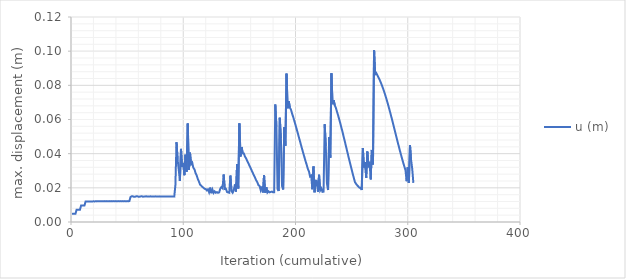
| Category | u (m) |
|---|---|
| 1.0 | 0.005 |
| 2.0 | 0.005 |
| 3.0 | 0.005 |
| 4.0 | 0.005 |
| 5.0 | 0.007 |
| 6.0 | 0.007 |
| 7.0 | 0.007 |
| 8.0 | 0.007 |
| 9.0 | 0.01 |
| 10.0 | 0.01 |
| 11.0 | 0.01 |
| 12.0 | 0.01 |
| 13.0 | 0.012 |
| 14.0 | 0.012 |
| 15.0 | 0.012 |
| 16.0 | 0.012 |
| 17.0 | 0.012 |
| 18.0 | 0.012 |
| 19.0 | 0.012 |
| 20.0 | 0.012 |
| 21.0 | 0.012 |
| 22.0 | 0.012 |
| 23.0 | 0.012 |
| 24.0 | 0.012 |
| 25.0 | 0.012 |
| 26.0 | 0.012 |
| 27.0 | 0.012 |
| 28.0 | 0.012 |
| 29.0 | 0.012 |
| 30.0 | 0.012 |
| 31.0 | 0.012 |
| 32.0 | 0.012 |
| 33.0 | 0.012 |
| 34.0 | 0.012 |
| 35.0 | 0.012 |
| 36.0 | 0.012 |
| 37.0 | 0.012 |
| 38.0 | 0.012 |
| 39.0 | 0.012 |
| 40.0 | 0.012 |
| 41.0 | 0.012 |
| 42.0 | 0.012 |
| 43.0 | 0.012 |
| 44.0 | 0.012 |
| 45.0 | 0.012 |
| 46.0 | 0.012 |
| 47.0 | 0.012 |
| 48.0 | 0.012 |
| 49.0 | 0.012 |
| 50.0 | 0.012 |
| 51.0 | 0.012 |
| 52.0 | 0.012 |
| 53.0 | 0.015 |
| 54.0 | 0.015 |
| 55.0 | 0.015 |
| 56.0 | 0.015 |
| 57.0 | 0.015 |
| 58.0 | 0.015 |
| 59.0 | 0.015 |
| 60.0 | 0.015 |
| 61.0 | 0.015 |
| 62.0 | 0.015 |
| 63.0 | 0.015 |
| 64.0 | 0.015 |
| 65.0 | 0.015 |
| 66.0 | 0.015 |
| 67.0 | 0.015 |
| 68.0 | 0.015 |
| 69.0 | 0.015 |
| 70.0 | 0.015 |
| 71.0 | 0.015 |
| 72.0 | 0.015 |
| 73.0 | 0.015 |
| 74.0 | 0.015 |
| 75.0 | 0.015 |
| 76.0 | 0.015 |
| 77.0 | 0.015 |
| 78.0 | 0.015 |
| 79.0 | 0.015 |
| 80.0 | 0.015 |
| 81.0 | 0.015 |
| 82.0 | 0.015 |
| 83.0 | 0.015 |
| 84.0 | 0.015 |
| 85.0 | 0.015 |
| 86.0 | 0.015 |
| 87.0 | 0.015 |
| 88.0 | 0.015 |
| 89.0 | 0.015 |
| 90.0 | 0.015 |
| 91.0 | 0.015 |
| 92.0 | 0.015 |
| 93.0 | 0.022 |
| 94.0 | 0.047 |
| 95.0 | 0.036 |
| 96.0 | 0.03 |
| 97.0 | 0.024 |
| 98.0 | 0.043 |
| 99.0 | 0.032 |
| 100.0 | 0.035 |
| 101.0 | 0.027 |
| 102.0 | 0.039 |
| 103.0 | 0.029 |
| 104.0 | 0.058 |
| 105.0 | 0.03 |
| 106.0 | 0.041 |
| 107.0 | 0.034 |
| 108.0 | 0.035 |
| 109.0 | 0.032 |
| 110.0 | 0.031 |
| 111.0 | 0.029 |
| 112.0 | 0.027 |
| 113.0 | 0.025 |
| 114.0 | 0.024 |
| 115.0 | 0.022 |
| 116.0 | 0.021 |
| 117.0 | 0.021 |
| 118.0 | 0.02 |
| 119.0 | 0.019 |
| 120.0 | 0.019 |
| 121.0 | 0.019 |
| 122.0 | 0.019 |
| 123.0 | 0.017 |
| 124.0 | 0.02 |
| 125.0 | 0.017 |
| 126.0 | 0.019 |
| 127.0 | 0.017 |
| 128.0 | 0.018 |
| 129.0 | 0.017 |
| 130.0 | 0.018 |
| 131.0 | 0.017 |
| 132.0 | 0.017 |
| 133.0 | 0.02 |
| 134.0 | 0.02 |
| 135.0 | 0.02 |
| 136.0 | 0.028 |
| 137.0 | 0.019 |
| 138.0 | 0.019 |
| 139.0 | 0.018 |
| 140.0 | 0.017 |
| 141.0 | 0.017 |
| 142.0 | 0.027 |
| 143.0 | 0.018 |
| 144.0 | 0.017 |
| 145.0 | 0.019 |
| 146.0 | 0.022 |
| 147.0 | 0.018 |
| 148.0 | 0.034 |
| 149.0 | 0.02 |
| 150.0 | 0.058 |
| 151.0 | 0.038 |
| 152.0 | 0.044 |
| 153.0 | 0.04 |
| 154.0 | 0.04 |
| 155.0 | 0.038 |
| 156.0 | 0.037 |
| 157.0 | 0.036 |
| 158.0 | 0.034 |
| 159.0 | 0.033 |
| 160.0 | 0.032 |
| 161.0 | 0.03 |
| 162.0 | 0.029 |
| 163.0 | 0.027 |
| 164.0 | 0.026 |
| 165.0 | 0.024 |
| 166.0 | 0.023 |
| 167.0 | 0.022 |
| 168.0 | 0.021 |
| 169.0 | 0.019 |
| 170.0 | 0.021 |
| 171.0 | 0.017 |
| 172.0 | 0.027 |
| 173.0 | 0.017 |
| 174.0 | 0.02 |
| 175.0 | 0.017 |
| 176.0 | 0.018 |
| 177.0 | 0.017 |
| 178.0 | 0.018 |
| 179.0 | 0.018 |
| 180.0 | 0.017 |
| 181.0 | 0.017 |
| 182.0 | 0.069 |
| 183.0 | 0.056 |
| 184.0 | 0.019 |
| 185.0 | 0.018 |
| 186.0 | 0.061 |
| 187.0 | 0.049 |
| 188.0 | 0.021 |
| 189.0 | 0.019 |
| 190.0 | 0.056 |
| 191.0 | 0.045 |
| 192.0 | 0.087 |
| 193.0 | 0.067 |
| 194.0 | 0.071 |
| 195.0 | 0.067 |
| 196.0 | 0.066 |
| 197.0 | 0.063 |
| 198.0 | 0.061 |
| 199.0 | 0.059 |
| 200.0 | 0.057 |
| 201.0 | 0.054 |
| 202.0 | 0.052 |
| 203.0 | 0.05 |
| 204.0 | 0.047 |
| 205.0 | 0.045 |
| 206.0 | 0.042 |
| 207.0 | 0.04 |
| 208.0 | 0.038 |
| 209.0 | 0.036 |
| 210.0 | 0.033 |
| 211.0 | 0.031 |
| 212.0 | 0.03 |
| 213.0 | 0.027 |
| 214.0 | 0.027 |
| 215.0 | 0.019 |
| 216.0 | 0.033 |
| 217.0 | 0.017 |
| 218.0 | 0.024 |
| 219.0 | 0.024 |
| 220.0 | 0.018 |
| 221.0 | 0.028 |
| 222.0 | 0.018 |
| 223.0 | 0.02 |
| 224.0 | 0.018 |
| 225.0 | 0.018 |
| 226.0 | 0.057 |
| 227.0 | 0.044 |
| 228.0 | 0.023 |
| 229.0 | 0.019 |
| 230.0 | 0.05 |
| 231.0 | 0.038 |
| 232.0 | 0.087 |
| 233.0 | 0.069 |
| 234.0 | 0.071 |
| 235.0 | 0.068 |
| 236.0 | 0.067 |
| 237.0 | 0.064 |
| 238.0 | 0.062 |
| 239.0 | 0.06 |
| 240.0 | 0.058 |
| 241.0 | 0.055 |
| 242.0 | 0.052 |
| 243.0 | 0.05 |
| 244.0 | 0.047 |
| 245.0 | 0.044 |
| 246.0 | 0.042 |
| 247.0 | 0.039 |
| 248.0 | 0.036 |
| 249.0 | 0.033 |
| 250.0 | 0.031 |
| 251.0 | 0.028 |
| 252.0 | 0.026 |
| 253.0 | 0.023 |
| 254.0 | 0.022 |
| 255.0 | 0.021 |
| 256.0 | 0.021 |
| 257.0 | 0.02 |
| 258.0 | 0.02 |
| 259.0 | 0.019 |
| 260.0 | 0.043 |
| 261.0 | 0.032 |
| 262.0 | 0.035 |
| 263.0 | 0.026 |
| 264.0 | 0.041 |
| 265.0 | 0.033 |
| 266.0 | 0.034 |
| 267.0 | 0.025 |
| 268.0 | 0.042 |
| 269.0 | 0.034 |
| 270.0 | 0.101 |
| 271.0 | 0.086 |
| 272.0 | 0.087 |
| 273.0 | 0.086 |
| 274.0 | 0.085 |
| 275.0 | 0.083 |
| 276.0 | 0.082 |
| 277.0 | 0.08 |
| 278.0 | 0.078 |
| 279.0 | 0.076 |
| 280.0 | 0.074 |
| 281.0 | 0.072 |
| 282.0 | 0.07 |
| 283.0 | 0.067 |
| 284.0 | 0.065 |
| 285.0 | 0.063 |
| 286.0 | 0.06 |
| 287.0 | 0.057 |
| 288.0 | 0.055 |
| 289.0 | 0.052 |
| 290.0 | 0.049 |
| 291.0 | 0.047 |
| 292.0 | 0.044 |
| 293.0 | 0.042 |
| 294.0 | 0.039 |
| 295.0 | 0.037 |
| 296.0 | 0.035 |
| 297.0 | 0.032 |
| 298.0 | 0.03 |
| 299.0 | 0.024 |
| 300.0 | 0.032 |
| 301.0 | 0.023 |
| 302.0 | 0.045 |
| 303.0 | 0.036 |
| 304.0 | 0.031 |
| 305.0 | 0.023 |
| 305.0 | 0.023 |
| 305.0 | 0.023 |
| 305.0 | 0.023 |
| 305.0 | 0.023 |
| 305.0 | 0.023 |
| 305.0 | 0.023 |
| 305.0 | 0.023 |
| 305.0 | 0.023 |
| 305.0 | 0.023 |
| 305.0 | 0.023 |
| 305.0 | 0.023 |
| 305.0 | 0.023 |
| 305.0 | 0.023 |
| 305.0 | 0.023 |
| 305.0 | 0.023 |
| 305.0 | 0.023 |
| 305.0 | 0.023 |
| 305.0 | 0.023 |
| 305.0 | 0.023 |
| 305.0 | 0.023 |
| 305.0 | 0.023 |
| 305.0 | 0.023 |
| 305.0 | 0.023 |
| 305.0 | 0.023 |
| 305.0 | 0.023 |
| 305.0 | 0.023 |
| 305.0 | 0.023 |
| 305.0 | 0.023 |
| 305.0 | 0.023 |
| 305.0 | 0.023 |
| 305.0 | 0.023 |
| 305.0 | 0.023 |
| 305.0 | 0.023 |
| 305.0 | 0.023 |
| 305.0 | 0.023 |
| 305.0 | 0.023 |
| 305.0 | 0.023 |
| 305.0 | 0.023 |
| 305.0 | 0.023 |
| 305.0 | 0.023 |
| 305.0 | 0.023 |
| 305.0 | 0.023 |
| 305.0 | 0.023 |
| 305.0 | 0.023 |
| 305.0 | 0.023 |
| 305.0 | 0.023 |
| 305.0 | 0.023 |
| 305.0 | 0.023 |
| 305.0 | 0.023 |
| 305.0 | 0.023 |
| 305.0 | 0.023 |
| 305.0 | 0.023 |
| 305.0 | 0.023 |
| 305.0 | 0.023 |
| 305.0 | 0.023 |
| 305.0 | 0.023 |
| 305.0 | 0.023 |
| 305.0 | 0.023 |
| 305.0 | 0.023 |
| 305.0 | 0.023 |
| 305.0 | 0.023 |
| 305.0 | 0.023 |
| 305.0 | 0.023 |
| 305.0 | 0.023 |
| 305.0 | 0.023 |
| 305.0 | 0.023 |
| 305.0 | 0.023 |
| 305.0 | 0.023 |
| 305.0 | 0.023 |
| 305.0 | 0.023 |
| 305.0 | 0.023 |
| 305.0 | 0.023 |
| 305.0 | 0.023 |
| 305.0 | 0.023 |
| 305.0 | 0.023 |
| 305.0 | 0.023 |
| 305.0 | 0.023 |
| 305.0 | 0.023 |
| 305.0 | 0.023 |
| 305.0 | 0.023 |
| 305.0 | 0.023 |
| 305.0 | 0.023 |
| 305.0 | 0.023 |
| 305.0 | 0.023 |
| 305.0 | 0.023 |
| 305.0 | 0.023 |
| 305.0 | 0.023 |
| 305.0 | 0.023 |
| 305.0 | 0.023 |
| 305.0 | 0.023 |
| 305.0 | 0.023 |
| 305.0 | 0.023 |
| 305.0 | 0.023 |
| 305.0 | 0.023 |
| 305.0 | 0.023 |
| 305.0 | 0.023 |
| 305.0 | 0.023 |
| 305.0 | 0.023 |
| 305.0 | 0.023 |
| 305.0 | 0.023 |
| 305.0 | 0.023 |
| 305.0 | 0.023 |
| 305.0 | 0.023 |
| 305.0 | 0.023 |
| 305.0 | 0.023 |
| 305.0 | 0.023 |
| 305.0 | 0.023 |
| 305.0 | 0.023 |
| 305.0 | 0.023 |
| 305.0 | 0.023 |
| 305.0 | 0.023 |
| 305.0 | 0.023 |
| 305.0 | 0.023 |
| 305.0 | 0.023 |
| 305.0 | 0.023 |
| 305.0 | 0.023 |
| 305.0 | 0.023 |
| 305.0 | 0.023 |
| 305.0 | 0.023 |
| 305.0 | 0.023 |
| 305.0 | 0.023 |
| 305.0 | 0.023 |
| 305.0 | 0.023 |
| 305.0 | 0.023 |
| 305.0 | 0.023 |
| 305.0 | 0.023 |
| 305.0 | 0.023 |
| 305.0 | 0.023 |
| 305.0 | 0.023 |
| 305.0 | 0.023 |
| 305.0 | 0.023 |
| 305.0 | 0.023 |
| 305.0 | 0.023 |
| 305.0 | 0.023 |
| 305.0 | 0.023 |
| 305.0 | 0.023 |
| 305.0 | 0.023 |
| 305.0 | 0.023 |
| 305.0 | 0.023 |
| 305.0 | 0.023 |
| 305.0 | 0.023 |
| 305.0 | 0.023 |
| 305.0 | 0.023 |
| 305.0 | 0.023 |
| 305.0 | 0.023 |
| 305.0 | 0.023 |
| 305.0 | 0.023 |
| 305.0 | 0.023 |
| 305.0 | 0.023 |
| 305.0 | 0.023 |
| 305.0 | 0.023 |
| 305.0 | 0.023 |
| 305.0 | 0.023 |
| 305.0 | 0.023 |
| 305.0 | 0.023 |
| 305.0 | 0.023 |
| 305.0 | 0.023 |
| 305.0 | 0.023 |
| 305.0 | 0.023 |
| 305.0 | 0.023 |
| 305.0 | 0.023 |
| 305.0 | 0.023 |
| 305.0 | 0.023 |
| 305.0 | 0.023 |
| 305.0 | 0.023 |
| 305.0 | 0.023 |
| 305.0 | 0.023 |
| 305.0 | 0.023 |
| 305.0 | 0.023 |
| 305.0 | 0.023 |
| 305.0 | 0.023 |
| 305.0 | 0.023 |
| 305.0 | 0.023 |
| 305.0 | 0.023 |
| 305.0 | 0.023 |
| 305.0 | 0.023 |
| 305.0 | 0.023 |
| 305.0 | 0.023 |
| 305.0 | 0.023 |
| 305.0 | 0.023 |
| 305.0 | 0.023 |
| 305.0 | 0.023 |
| 305.0 | 0.023 |
| 305.0 | 0.023 |
| 305.0 | 0.023 |
| 305.0 | 0.023 |
| 305.0 | 0.023 |
| 305.0 | 0.023 |
| 305.0 | 0.023 |
| 305.0 | 0.023 |
| 305.0 | 0.023 |
| 305.0 | 0.023 |
| 305.0 | 0.023 |
| 305.0 | 0.023 |
| 305.0 | 0.023 |
| 305.0 | 0.023 |
| 305.0 | 0.023 |
| 305.0 | 0.023 |
| 305.0 | 0.023 |
| 305.0 | 0.023 |
| 305.0 | 0.023 |
| 305.0 | 0.023 |
| 305.0 | 0.023 |
| 305.0 | 0.023 |
| 305.0 | 0.023 |
| 305.0 | 0.023 |
| 305.0 | 0.023 |
| 305.0 | 0.023 |
| 305.0 | 0.023 |
| 305.0 | 0.023 |
| 305.0 | 0.023 |
| 305.0 | 0.023 |
| 305.0 | 0.023 |
| 305.0 | 0.023 |
| 305.0 | 0.023 |
| 305.0 | 0.023 |
| 305.0 | 0.023 |
| 305.0 | 0.023 |
| 305.0 | 0.023 |
| 305.0 | 0.023 |
| 305.0 | 0.023 |
| 305.0 | 0.023 |
| 305.0 | 0.023 |
| 305.0 | 0.023 |
| 305.0 | 0.023 |
| 305.0 | 0.023 |
| 305.0 | 0.023 |
| 305.0 | 0.023 |
| 305.0 | 0.023 |
| 305.0 | 0.023 |
| 305.0 | 0.023 |
| 305.0 | 0.023 |
| 305.0 | 0.023 |
| 305.0 | 0.023 |
| 305.0 | 0.023 |
| 305.0 | 0.023 |
| 305.0 | 0.023 |
| 305.0 | 0.023 |
| 305.0 | 0.023 |
| 305.0 | 0.023 |
| 305.0 | 0.023 |
| 305.0 | 0.023 |
| 305.0 | 0.023 |
| 305.0 | 0.023 |
| 305.0 | 0.023 |
| 305.0 | 0.023 |
| 305.0 | 0.023 |
| 305.0 | 0.023 |
| 305.0 | 0.023 |
| 305.0 | 0.023 |
| 305.0 | 0.023 |
| 305.0 | 0.023 |
| 305.0 | 0.023 |
| 305.0 | 0.023 |
| 305.0 | 0.023 |
| 305.0 | 0.023 |
| 305.0 | 0.023 |
| 305.0 | 0.023 |
| 305.0 | 0.023 |
| 305.0 | 0.023 |
| 305.0 | 0.023 |
| 305.0 | 0.023 |
| 305.0 | 0.023 |
| 305.0 | 0.023 |
| 305.0 | 0.023 |
| 305.0 | 0.023 |
| 305.0 | 0.023 |
| 305.0 | 0.023 |
| 305.0 | 0.023 |
| 305.0 | 0.023 |
| 305.0 | 0.023 |
| 305.0 | 0.023 |
| 305.0 | 0.023 |
| 305.0 | 0.023 |
| 305.0 | 0.023 |
| 305.0 | 0.023 |
| 305.0 | 0.023 |
| 305.0 | 0.023 |
| 305.0 | 0.023 |
| 305.0 | 0.023 |
| 305.0 | 0.023 |
| 305.0 | 0.023 |
| 305.0 | 0.023 |
| 305.0 | 0.023 |
| 305.0 | 0.023 |
| 305.0 | 0.023 |
| 305.0 | 0.023 |
| 305.0 | 0.023 |
| 305.0 | 0.023 |
| 305.0 | 0.023 |
| 305.0 | 0.023 |
| 305.0 | 0.023 |
| 305.0 | 0.023 |
| 305.0 | 0.023 |
| 305.0 | 0.023 |
| 305.0 | 0.023 |
| 305.0 | 0.023 |
| 305.0 | 0.023 |
| 305.0 | 0.023 |
| 305.0 | 0.023 |
| 305.0 | 0.023 |
| 305.0 | 0.023 |
| 305.0 | 0.023 |
| 305.0 | 0.023 |
| 305.0 | 0.023 |